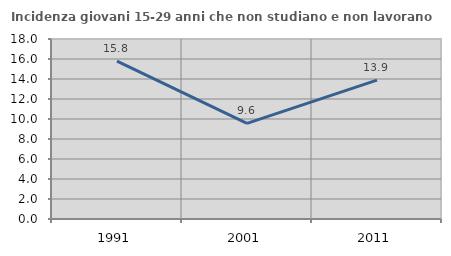
| Category | Incidenza giovani 15-29 anni che non studiano e non lavorano  |
|---|---|
| 1991.0 | 15.789 |
| 2001.0 | 9.559 |
| 2011.0 | 13.889 |